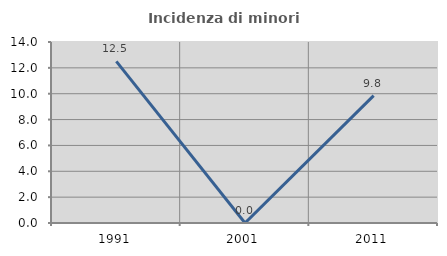
| Category | Incidenza di minori stranieri |
|---|---|
| 1991.0 | 12.5 |
| 2001.0 | 0 |
| 2011.0 | 9.848 |